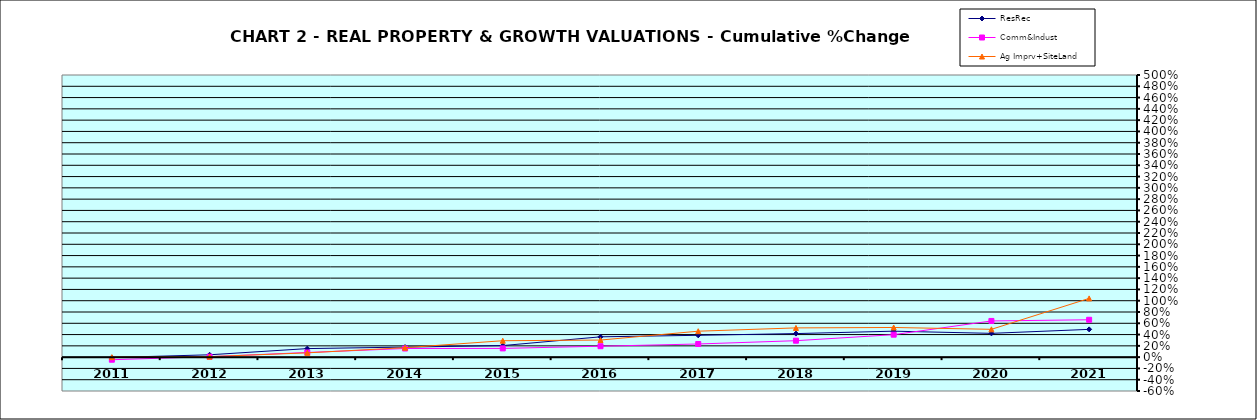
| Category | ResRec | Comm&Indust | Ag Imprv+SiteLand |
|---|---|---|---|
| 2011.0 | -0.007 | -0.046 | 0 |
| 2012.0 | 0.042 | 0.008 | 0.009 |
| 2013.0 | 0.151 | 0.082 | 0.076 |
| 2014.0 | 0.178 | 0.153 | 0.168 |
| 2015.0 | 0.205 | 0.155 | 0.291 |
| 2016.0 | 0.36 | 0.194 | 0.303 |
| 2017.0 | 0.387 | 0.233 | 0.46 |
| 2018.0 | 0.418 | 0.291 | 0.518 |
| 2019.0 | 0.46 | 0.398 | 0.526 |
| 2020.0 | 0.422 | 0.641 | 0.493 |
| 2021.0 | 0.492 | 0.662 | 1.041 |